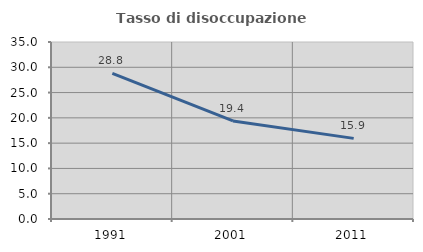
| Category | Tasso di disoccupazione giovanile  |
|---|---|
| 1991.0 | 28.814 |
| 2001.0 | 19.388 |
| 2011.0 | 15.942 |